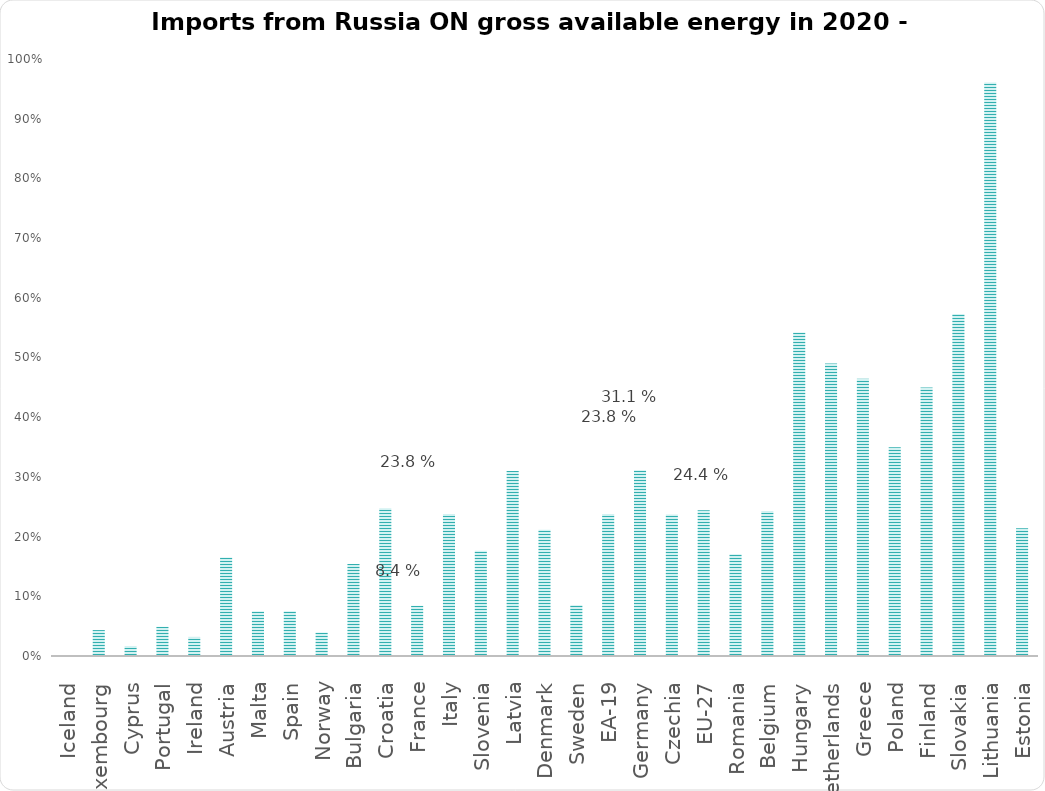
| Category | Total |
|---|---|
| Iceland | 0 |
| Luxembourg | 0.043 |
| Cyprus | 0.017 |
| Portugal | 0.049 |
| Ireland | 0.032 |
| Austria | 0.165 |
| Malta | 0.075 |
| Spain | 0.075 |
| Norway | 0.039 |
| Bulgaria | 0.154 |
| Croatia | 0.247 |
| France | 0.084 |
| Italy | 0.238 |
| Slovenia | 0.176 |
| Latvia | 0.31 |
| Denmark | 0.211 |
| Sweden | 0.085 |
| EA-19 | 0.238 |
| Germany | 0.311 |
| Czechia | 0.237 |
| EU-27 | 0.244 |
| Romania | 0.17 |
| Belgium | 0.243 |
| Hungary | 0.542 |
| Netherlands | 0.49 |
| Greece | 0.465 |
| Poland | 0.35 |
| Finland | 0.45 |
| Slovakia | 0.573 |
| Lithuania | 0.961 |
| Estonia | 0.214 |